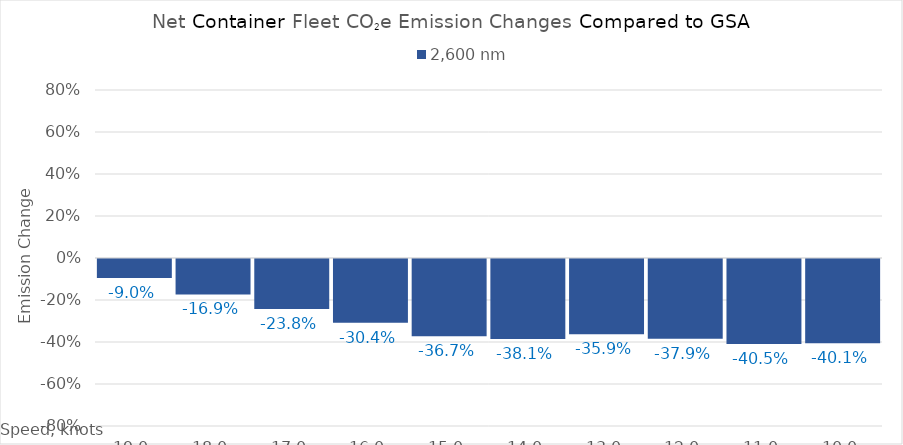
| Category | 2,600 |
|---|---|
| 19.0 | -0.09 |
| 18.0 | -0.169 |
| 17.0 | -0.238 |
| 16.0 | -0.304 |
| 15.0 | -0.367 |
| 14.0 | -0.381 |
| 13.0 | -0.359 |
| 12.0 | -0.379 |
| 11.0 | -0.405 |
| 10.0 | -0.401 |